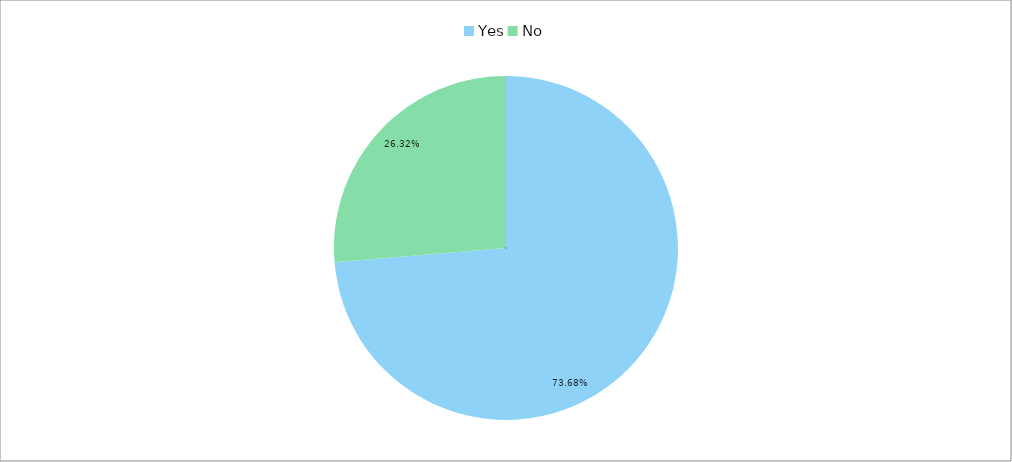
| Category | Total (% & freq col) |
|---|---|
| Yes | 0.737 |
| No | 0.263 |